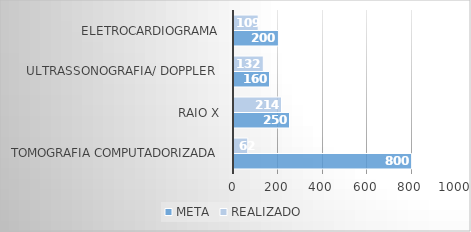
| Category | META | REALIZADO |
|---|---|---|
| Tomografia computadorizada | 800 | 62 |
| Raio x | 250 | 214 |
| Ultrassonografia/ Doppler  | 160 | 132 |
| Eletrocardiograma | 200 | 109 |